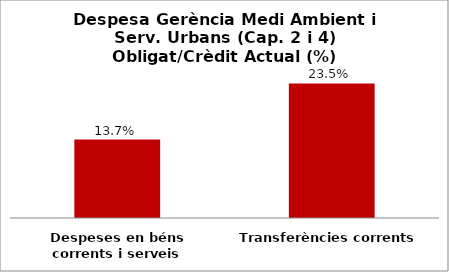
| Category | Series 0 |
|---|---|
| Despeses en béns corrents i serveis | 0.137 |
| Transferències corrents | 0.235 |